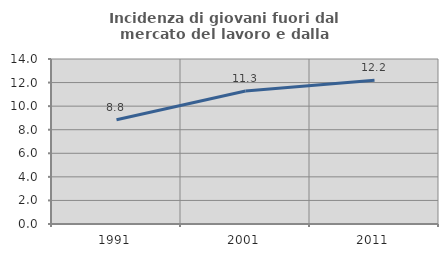
| Category | Incidenza di giovani fuori dal mercato del lavoro e dalla formazione  |
|---|---|
| 1991.0 | 8.841 |
| 2001.0 | 11.282 |
| 2011.0 | 12.195 |